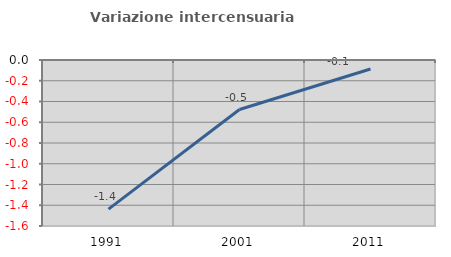
| Category | Variazione intercensuaria annua |
|---|---|
| 1991.0 | -1.437 |
| 2001.0 | -0.477 |
| 2011.0 | -0.086 |